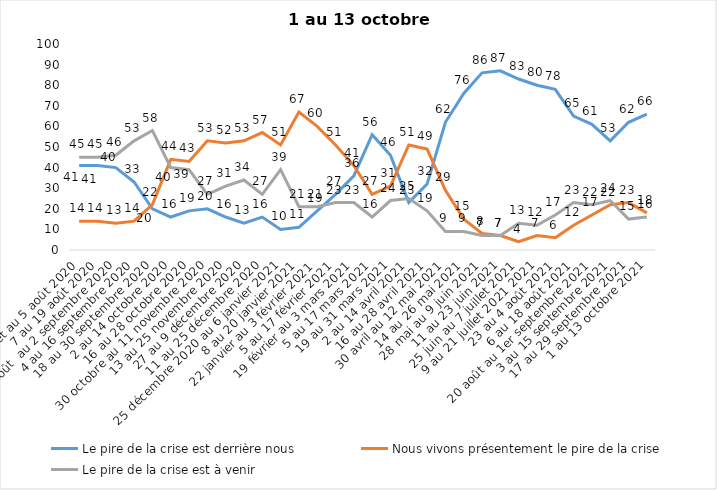
| Category | Le pire de la crise est derrière nous | Nous vivons présentement le pire de la crise | Le pire de la crise est à venir |
|---|---|---|---|
| 24 juillet au 5 août 2020 | 41 | 14 | 45 |
| 7 au 19 août 2020 | 41 | 14 | 45 |
| 21 août  au 2 septembre 2020 | 40 | 13 | 46 |
| 4 au 16 septembre 2020 | 33 | 14 | 53 |
| 18 au 30 septembre 2020 | 20 | 22 | 58 |
| 2 au 14 octobre 2020 | 16 | 44 | 40 |
| 16 au 28 octobre 2020 | 19 | 43 | 39 |
| 30 octobre au 11 novembre 2020 | 20 | 53 | 27 |
| 13 au 25 novembre 2020 | 16 | 52 | 31 |
| 27 au 9 décembre 2020 | 13 | 53 | 34 |
| 11 au 25 décembre 2020 | 16 | 57 | 27 |
| 25 décembre 2020 au 6 janvier 2021 | 10 | 51 | 39 |
| 8 au 20 janvier 2021 | 11 | 67 | 21 |
| 22 janvier au 3 février 2021 | 19 | 60 | 21 |
| 5 au 17 février 2021 | 27 | 51 | 23 |
| 19 février au 3 mars 2021 | 36 | 41 | 23 |
| 5 au 17 mars 2021 | 56 | 27 | 16 |
| 19 au 31 mars 2021 | 46 | 31 | 24 |
| 2 au 14 avril 2021 | 23 | 51 | 25 |
| 16 au 28 avril 2021 | 32 | 49 | 19 |
| 30 avril au 12 mai 2021 | 62 | 29 | 9 |
| 14 au 26 mai 2021 | 76 | 15 | 9 |
| 28 mai au 9 juin 2021 | 86 | 8 | 7 |
| 11 au 23 juin 2021 | 87 | 7 | 7 |
| 25 juin au 7 juillet 2021 | 83 | 4 | 13 |
| 9 au 21 juillet 2021 2021 | 80 | 7 | 12 |
| 23 au 4 août 2021 | 78 | 6 | 17 |
| 6 au 18 août 2021 | 65 | 12 | 23 |
| 20 août au 1er septembre 2021 | 61 | 17 | 22 |
| 3 au 15 septembre 2021 | 53 | 22 | 24 |
| 17 au 29 septembre 2021 | 62 | 23 | 15 |
| 1 au 13 octobre 2021 | 66 | 18 | 16 |